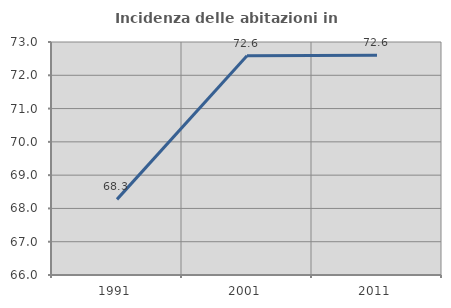
| Category | Incidenza delle abitazioni in proprietà  |
|---|---|
| 1991.0 | 68.272 |
| 2001.0 | 72.589 |
| 2011.0 | 72.603 |